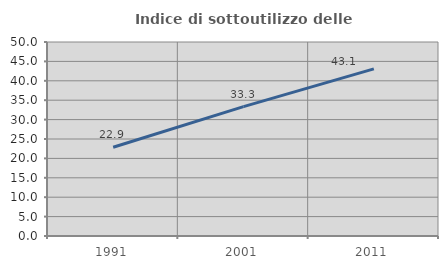
| Category | Indice di sottoutilizzo delle abitazioni  |
|---|---|
| 1991.0 | 22.883 |
| 2001.0 | 33.333 |
| 2011.0 | 43.076 |